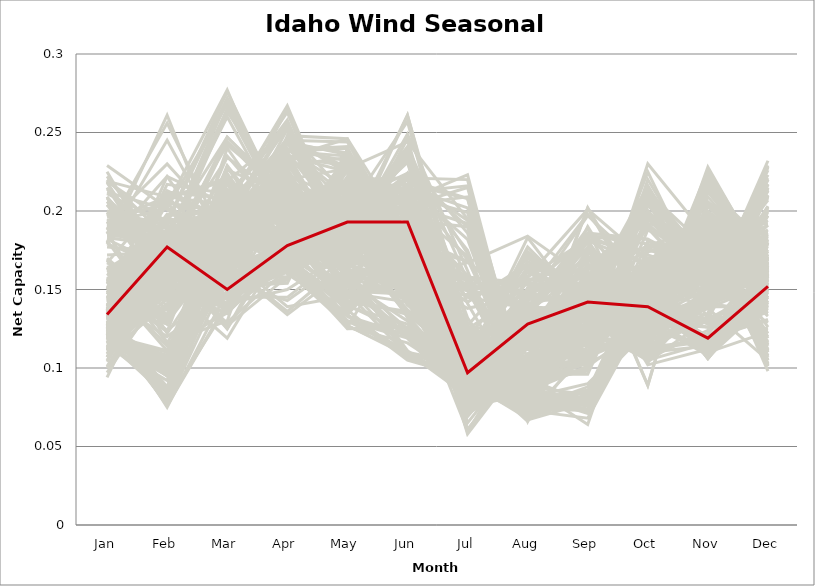
| Category | sample_001 | sample_002 | sample_003 | sample_004 | sample_005 | sample_006 | sample_007 | sample_008 | sample_009 | sample_010 | sample_011 | sample_012 | sample_013 | sample_014 | sample_015 | sample_016 | sample_017 | sample_018 | sample_019 | sample_020 | sample_021 | sample_022 | sample_023 | sample_024 | sample_025 | sample_026 | sample_027 | sample_028 | sample_029 | sample_030 | sample_031 | sample_032 | sample_033 | sample_034 | sample_035 | sample_036 | sample_037 | sample_038 | sample_039 | sample_040 | sample_041 | sample_042 | sample_043 | sample_044 | sample_045 | sample_046 | sample_047 | sample_048 | sample_049 | sample_050 | sample_051 | sample_052 | sample_053 | sample_054 | sample_055 | sample_056 | sample_057 | sample_058 | sample_059 | sample_060 | sample_061 | sample_062 | sample_063 | sample_064 | sample_065 | sample_066 | sample_067 | sample_068 | sample_069 | sample_070 | sample_071 | sample_072 | sample_073 | sample_074 | sample_075 | sample_076 | sample_077 | sample_078 | sample_079 | sample_080 | sample_081 | sample_082 | sample_083 | sample_084 | sample_085 | sample_086 | sample_087 | sample_088 | sample_089 | sample_090 | sample_091 | sample_092 | sample_093 | sample_094 | sample_095 | sample_096 | sample_097 | sample_098 | sample_099 | sample_100 | sample_101 | sample_102 | sample_103 | sample_104 | sample_105 | sample_106 | sample_107 | sample_108 | sample_109 | sample_110 | sample_111 | sample_112 | sample_113 | sample_114 | sample_115 | sample_116 | sample_117 | sample_118 | sample_119 | sample_120 | sample_121 | sample_122 | sample_123 | sample_124 | sample_125 | sample_126 | sample_127 | sample_128 | sample_129 | sample_130 | sample_131 | sample_132 | sample_133 | sample_134 | sample_135 | sample_136 | sample_137 | sample_138 | sample_139 | sample_140 | sample_141 | sample_142 | sample_143 | sample_144 | sample_145 | sample_146 | sample_147 | sample_148 | sample_149 | sample_150 | sample_151 | sample_152 | sample_153 | sample_154 | sample_155 | sample_156 | sample_157 | sample_158 | sample_159 | sample_160 | sample_161 | sample_162 | sample_163 | sample_164 | sample_165 | sample_166 | sample_167 | sample_168 | sample_169 | sample_170 | sample_171 | sample_172 | sample_173 | sample_174 | sample_175 | sample_176 | sample_177 | sample_178 | sample_179 | sample_180 | sample_181 | sample_183 | sample_184 | sample_185 | sample_186 | sample_187 | sample_188 | sample_189 | sample_190 | sample_191 | sample_192 | sample_193 | sample_194 | sample_195 | sample_196 | sample_197 | sample_198 | sample_199 | sample_200 | sample_201 | sample_202 | sample_203 | sample_204 | sample_205 | sample_206 | sample_207 | sample_208 | sample_209 | sample_210 | sample_211 | sample_212 | sample_213 | sample_214 | sample_215 | sample_216 | sample_217 | sample_218 | sample_219 | sample_220 | sample_221 | sample_222 | sample_223 | sample_224 | sample_225 | sample_226 | sample_227 | sample_228 | sample_229 | sample_230 | sample_231 | sample_232 | sample_233 | sample_234 | sample_235 | sample_236 | sample_237 | sample_238 | sample_239 | sample_240 | sample_241 | sample_242 | sample_243 | sample_244 | sample_245 | sample_246 | sample_247 | sample_248 | sample_249 | sample_250 | sample_182 |
|---|---|---|---|---|---|---|---|---|---|---|---|---|---|---|---|---|---|---|---|---|---|---|---|---|---|---|---|---|---|---|---|---|---|---|---|---|---|---|---|---|---|---|---|---|---|---|---|---|---|---|---|---|---|---|---|---|---|---|---|---|---|---|---|---|---|---|---|---|---|---|---|---|---|---|---|---|---|---|---|---|---|---|---|---|---|---|---|---|---|---|---|---|---|---|---|---|---|---|---|---|---|---|---|---|---|---|---|---|---|---|---|---|---|---|---|---|---|---|---|---|---|---|---|---|---|---|---|---|---|---|---|---|---|---|---|---|---|---|---|---|---|---|---|---|---|---|---|---|---|---|---|---|---|---|---|---|---|---|---|---|---|---|---|---|---|---|---|---|---|---|---|---|---|---|---|---|---|---|---|---|---|---|---|---|---|---|---|---|---|---|---|---|---|---|---|---|---|---|---|---|---|---|---|---|---|---|---|---|---|---|---|---|---|---|---|---|---|---|---|---|---|---|---|---|---|---|---|---|---|---|---|---|---|---|---|---|---|---|---|---|---|---|---|---|---|---|---|---|---|---|
| Jan | 0.162 | 0.135 | 0.179 | 0.112 | 0.193 | 0.135 | 0.128 | 0.126 | 0.18 | 0.145 | 0.206 | 0.135 | 0.132 | 0.184 | 0.127 | 0.115 | 0.113 | 0.101 | 0.123 | 0.209 | 0.133 | 0.133 | 0.115 | 0.134 | 0.14 | 0.152 | 0.145 | 0.219 | 0.114 | 0.206 | 0.137 | 0.198 | 0.094 | 0.157 | 0.126 | 0.132 | 0.124 | 0.112 | 0.164 | 0.109 | 0.156 | 0.192 | 0.111 | 0.115 | 0.189 | 0.13 | 0.125 | 0.119 | 0.151 | 0.116 | 0.139 | 0.135 | 0.185 | 0.2 | 0.119 | 0.118 | 0.119 | 0.215 | 0.194 | 0.193 | 0.116 | 0.12 | 0.126 | 0.204 | 0.119 | 0.187 | 0.151 | 0.122 | 0.115 | 0.219 | 0.139 | 0.127 | 0.154 | 0.155 | 0.12 | 0.192 | 0.146 | 0.22 | 0.188 | 0.135 | 0.139 | 0.179 | 0.109 | 0.128 | 0.19 | 0.192 | 0.127 | 0.112 | 0.16 | 0.172 | 0.157 | 0.138 | 0.127 | 0.128 | 0.212 | 0.225 | 0.124 | 0.15 | 0.19 | 0.121 | 0.148 | 0.147 | 0.199 | 0.183 | 0.151 | 0.145 | 0.13 | 0.12 | 0.1 | 0.122 | 0.133 | 0.12 | 0.123 | 0.124 | 0.107 | 0.138 | 0.214 | 0.155 | 0.19 | 0.169 | 0.177 | 0.126 | 0.12 | 0.132 | 0.117 | 0.115 | 0.208 | 0.122 | 0.142 | 0.133 | 0.125 | 0.126 | 0.155 | 0.138 | 0.148 | 0.152 | 0.138 | 0.163 | 0.154 | 0.138 | 0.124 | 0.155 | 0.147 | 0.132 | 0.124 | 0.139 | 0.14 | 0.167 | 0.187 | 0.135 | 0.121 | 0.134 | 0.189 | 0.144 | 0.136 | 0.154 | 0.097 | 0.229 | 0.144 | 0.15 | 0.118 | 0.104 | 0.124 | 0.204 | 0.19 | 0.123 | 0.211 | 0.118 | 0.12 | 0.123 | 0.152 | 0.122 | 0.142 | 0.196 | 0.156 | 0.148 | 0.133 | 0.193 | 0.132 | 0.118 | 0.116 | 0.126 | 0.187 | 0.136 | 0.164 | 0.188 | 0.109 | 0.131 | 0.192 | 0.12 | 0.107 | 0.218 | 0.144 | 0.12 | 0.117 | 0.12 | 0.119 | 0.128 | 0.121 | 0.136 | 0.118 | 0.191 | 0.137 | 0.122 | 0.222 | 0.17 | 0.118 | 0.135 | 0.179 | 0.111 | 0.121 | 0.105 | 0.136 | 0.14 | 0.155 | 0.182 | 0.111 | 0.126 | 0.132 | 0.185 | 0.192 | 0.122 | 0.133 | 0.199 | 0.2 | 0.181 | 0.137 | 0.19 | 0.107 | 0.167 | 0.13 | 0.127 | 0.219 | 0.161 | 0.112 | 0.159 | 0.188 | 0.143 | 0.121 | 0.128 | 0.164 | 0.122 | 0.188 | 0.139 | 0.129 | 0.129 | 0.148 | 0.13 | 0.209 | 0.134 |
| Feb | 0.179 | 0.157 | 0.164 | 0.162 | 0.209 | 0.222 | 0.077 | 0.169 | 0.245 | 0.17 | 0.17 | 0.086 | 0.137 | 0.183 | 0.188 | 0.1 | 0.168 | 0.161 | 0.175 | 0.138 | 0.167 | 0.081 | 0.098 | 0.15 | 0.148 | 0.124 | 0.178 | 0.209 | 0.108 | 0.174 | 0.176 | 0.171 | 0.173 | 0.129 | 0.15 | 0.088 | 0.099 | 0.108 | 0.116 | 0.173 | 0.183 | 0.195 | 0.163 | 0.086 | 0.174 | 0.083 | 0.183 | 0.161 | 0.123 | 0.174 | 0.079 | 0.086 | 0.184 | 0.191 | 0.107 | 0.179 | 0.166 | 0.156 | 0.205 | 0.166 | 0.151 | 0.11 | 0.087 | 0.154 | 0.157 | 0.116 | 0.168 | 0.102 | 0.106 | 0.193 | 0.128 | 0.182 | 0.178 | 0.128 | 0.169 | 0.187 | 0.144 | 0.183 | 0.256 | 0.166 | 0.168 | 0.222 | 0.151 | 0.174 | 0.193 | 0.23 | 0.157 | 0.161 | 0.147 | 0.174 | 0.18 | 0.087 | 0.104 | 0.085 | 0.201 | 0.16 | 0.166 | 0.134 | 0.195 | 0.158 | 0.165 | 0.194 | 0.148 | 0.178 | 0.185 | 0.171 | 0.076 | 0.159 | 0.15 | 0.169 | 0.148 | 0.173 | 0.158 | 0.166 | 0.151 | 0.183 | 0.176 | 0.175 | 0.176 | 0.13 | 0.174 | 0.152 | 0.096 | 0.155 | 0.095 | 0.092 | 0.173 | 0.171 | 0.131 | 0.145 | 0.182 | 0.159 | 0.195 | 0.148 | 0.179 | 0.17 | 0.084 | 0.187 | 0.169 | 0.131 | 0.157 | 0.114 | 0.188 | 0.176 | 0.14 | 0.205 | 0.187 | 0.143 | 0.173 | 0.075 | 0.111 | 0.085 | 0.175 | 0.12 | 0.16 | 0.213 | 0.153 | 0.202 | 0.193 | 0.209 | 0.104 | 0.164 | 0.148 | 0.18 | 0.183 | 0.101 | 0.192 | 0.1 | 0.108 | 0.172 | 0.128 | 0.163 | 0.174 | 0.204 | 0.186 | 0.131 | 0.187 | 0.177 | 0.174 | 0.154 | 0.087 | 0.163 | 0.122 | 0.208 | 0.177 | 0.181 | 0.141 | 0.179 | 0.202 | 0.16 | 0.173 | 0.163 | 0.186 | 0.108 | 0.082 | 0.099 | 0.102 | 0.077 | 0.212 | 0.167 | 0.146 | 0.182 | 0.217 | 0.095 | 0.171 | 0.137 | 0.14 | 0.16 | 0.261 | 0.156 | 0.158 | 0.17 | 0.176 | 0.197 | 0.111 | 0.164 | 0.144 | 0.077 | 0.164 | 0.185 | 0.189 | 0.102 | 0.18 | 0.184 | 0.182 | 0.13 | 0.206 | 0.181 | 0.166 | 0.211 | 0.156 | 0.148 | 0.145 | 0.178 | 0.164 | 0.188 | 0.191 | 0.17 | 0.174 | 0.17 | 0.134 | 0.095 | 0.187 | 0.133 | 0.079 | 0.17 | 0.198 | 0.152 | 0.164 | 0.177 |
| Mar | 0.177 | 0.175 | 0.18 | 0.217 | 0.173 | 0.204 | 0.168 | 0.15 | 0.175 | 0.214 | 0.193 | 0.186 | 0.204 | 0.194 | 0.157 | 0.2 | 0.166 | 0.197 | 0.146 | 0.201 | 0.125 | 0.166 | 0.21 | 0.138 | 0.14 | 0.154 | 0.182 | 0.204 | 0.207 | 0.185 | 0.144 | 0.247 | 0.135 | 0.179 | 0.166 | 0.184 | 0.202 | 0.219 | 0.13 | 0.169 | 0.187 | 0.184 | 0.213 | 0.202 | 0.19 | 0.162 | 0.158 | 0.155 | 0.224 | 0.149 | 0.169 | 0.169 | 0.26 | 0.162 | 0.184 | 0.165 | 0.163 | 0.197 | 0.17 | 0.244 | 0.163 | 0.167 | 0.181 | 0.187 | 0.129 | 0.177 | 0.206 | 0.196 | 0.169 | 0.173 | 0.193 | 0.127 | 0.18 | 0.24 | 0.156 | 0.187 | 0.235 | 0.2 | 0.179 | 0.145 | 0.153 | 0.165 | 0.201 | 0.145 | 0.276 | 0.188 | 0.212 | 0.211 | 0.182 | 0.244 | 0.183 | 0.183 | 0.205 | 0.19 | 0.173 | 0.204 | 0.152 | 0.229 | 0.168 | 0.144 | 0.196 | 0.19 | 0.201 | 0.242 | 0.191 | 0.182 | 0.141 | 0.17 | 0.135 | 0.171 | 0.144 | 0.152 | 0.155 | 0.154 | 0.198 | 0.135 | 0.263 | 0.189 | 0.234 | 0.181 | 0.187 | 0.16 | 0.201 | 0.174 | 0.195 | 0.196 | 0.187 | 0.146 | 0.184 | 0.191 | 0.16 | 0.217 | 0.19 | 0.135 | 0.186 | 0.196 | 0.175 | 0.193 | 0.139 | 0.194 | 0.17 | 0.135 | 0.194 | 0.162 | 0.197 | 0.2 | 0.205 | 0.183 | 0.197 | 0.149 | 0.193 | 0.172 | 0.175 | 0.147 | 0.155 | 0.194 | 0.119 | 0.183 | 0.204 | 0.219 | 0.174 | 0.166 | 0.195 | 0.158 | 0.265 | 0.207 | 0.272 | 0.207 | 0.203 | 0.168 | 0.228 | 0.146 | 0.135 | 0.277 | 0.145 | 0.228 | 0.188 | 0.179 | 0.139 | 0.151 | 0.194 | 0.168 | 0.18 | 0.221 | 0.184 | 0.271 | 0.187 | 0.185 | 0.268 | 0.171 | 0.167 | 0.199 | 0.204 | 0.182 | 0.19 | 0.202 | 0.191 | 0.141 | 0.208 | 0.137 | 0.165 | 0.271 | 0.211 | 0.196 | 0.184 | 0.19 | 0.199 | 0.144 | 0.165 | 0.198 | 0.162 | 0.145 | 0.125 | 0.202 | 0.137 | 0.226 | 0.152 | 0.159 | 0.145 | 0.2 | 0.17 | 0.161 | 0.189 | 0.157 | 0.174 | 0.181 | 0.192 | 0.166 | 0.141 | 0.193 | 0.212 | 0.221 | 0.189 | 0.183 | 0.155 | 0.191 | 0.172 | 0.144 | 0.154 | 0.156 | 0.178 | 0.193 | 0.247 | 0.212 | 0.139 | 0.149 | 0.192 | 0.18 | 0.192 | 0.15 |
| Apr | 0.178 | 0.179 | 0.212 | 0.168 | 0.225 | 0.195 | 0.238 | 0.163 | 0.208 | 0.187 | 0.201 | 0.247 | 0.167 | 0.179 | 0.164 | 0.253 | 0.134 | 0.169 | 0.165 | 0.202 | 0.186 | 0.234 | 0.253 | 0.177 | 0.189 | 0.229 | 0.201 | 0.225 | 0.258 | 0.207 | 0.182 | 0.21 | 0.174 | 0.176 | 0.161 | 0.234 | 0.246 | 0.251 | 0.237 | 0.201 | 0.208 | 0.206 | 0.166 | 0.211 | 0.204 | 0.239 | 0.167 | 0.178 | 0.17 | 0.167 | 0.243 | 0.238 | 0.19 | 0.231 | 0.208 | 0.193 | 0.18 | 0.209 | 0.199 | 0.209 | 0.18 | 0.219 | 0.252 | 0.215 | 0.163 | 0.191 | 0.2 | 0.207 | 0.214 | 0.237 | 0.17 | 0.158 | 0.21 | 0.186 | 0.179 | 0.206 | 0.191 | 0.217 | 0.192 | 0.182 | 0.178 | 0.201 | 0.171 | 0.165 | 0.197 | 0.216 | 0.197 | 0.167 | 0.177 | 0.204 | 0.198 | 0.239 | 0.244 | 0.243 | 0.232 | 0.236 | 0.154 | 0.179 | 0.215 | 0.168 | 0.187 | 0.166 | 0.198 | 0.21 | 0.202 | 0.198 | 0.247 | 0.165 | 0.172 | 0.194 | 0.163 | 0.166 | 0.177 | 0.17 | 0.16 | 0.174 | 0.21 | 0.202 | 0.207 | 0.188 | 0.205 | 0.158 | 0.212 | 0.177 | 0.24 | 0.256 | 0.217 | 0.176 | 0.165 | 0.171 | 0.166 | 0.192 | 0.168 | 0.191 | 0.203 | 0.161 | 0.229 | 0.167 | 0.188 | 0.183 | 0.171 | 0.237 | 0.22 | 0.178 | 0.164 | 0.195 | 0.212 | 0.178 | 0.197 | 0.245 | 0.265 | 0.235 | 0.203 | 0.222 | 0.186 | 0.166 | 0.182 | 0.216 | 0.221 | 0.191 | 0.212 | 0.204 | 0.166 | 0.233 | 0.193 | 0.256 | 0.2 | 0.263 | 0.267 | 0.165 | 0.177 | 0.161 | 0.192 | 0.187 | 0.207 | 0.172 | 0.197 | 0.206 | 0.191 | 0.166 | 0.239 | 0.166 | 0.186 | 0.19 | 0.206 | 0.193 | 0.166 | 0.214 | 0.196 | 0.139 | 0.136 | 0.201 | 0.182 | 0.209 | 0.236 | 0.212 | 0.256 | 0.248 | 0.193 | 0.165 | 0.19 | 0.2 | 0.192 | 0.203 | 0.22 | 0.188 | 0.174 | 0.183 | 0.2 | 0.162 | 0.164 | 0.145 | 0.194 | 0.216 | 0.244 | 0.211 | 0.185 | 0.244 | 0.158 | 0.186 | 0.22 | 0.22 | 0.223 | 0.217 | 0.227 | 0.185 | 0.205 | 0.226 | 0.15 | 0.186 | 0.202 | 0.187 | 0.21 | 0.201 | 0.143 | 0.21 | 0.223 | 0.175 | 0.17 | 0.177 | 0.177 | 0.216 | 0.208 | 0.172 | 0.244 | 0.156 | 0.22 | 0.175 | 0.207 | 0.178 |
| May | 0.205 | 0.189 | 0.149 | 0.126 | 0.172 | 0.215 | 0.24 | 0.22 | 0.207 | 0.137 | 0.166 | 0.224 | 0.125 | 0.148 | 0.239 | 0.186 | 0.163 | 0.137 | 0.231 | 0.171 | 0.195 | 0.246 | 0.168 | 0.221 | 0.218 | 0.183 | 0.208 | 0.192 | 0.168 | 0.152 | 0.181 | 0.193 | 0.201 | 0.152 | 0.192 | 0.229 | 0.195 | 0.163 | 0.188 | 0.201 | 0.211 | 0.196 | 0.13 | 0.191 | 0.149 | 0.241 | 0.238 | 0.212 | 0.142 | 0.212 | 0.237 | 0.235 | 0.182 | 0.172 | 0.2 | 0.204 | 0.211 | 0.161 | 0.169 | 0.193 | 0.168 | 0.172 | 0.209 | 0.163 | 0.19 | 0.161 | 0.137 | 0.189 | 0.174 | 0.169 | 0.14 | 0.183 | 0.19 | 0.144 | 0.211 | 0.161 | 0.135 | 0.189 | 0.215 | 0.181 | 0.227 | 0.182 | 0.127 | 0.222 | 0.191 | 0.183 | 0.138 | 0.134 | 0.158 | 0.194 | 0.195 | 0.232 | 0.189 | 0.203 | 0.172 | 0.17 | 0.232 | 0.149 | 0.184 | 0.206 | 0.136 | 0.182 | 0.161 | 0.195 | 0.22 | 0.216 | 0.226 | 0.197 | 0.195 | 0.214 | 0.185 | 0.226 | 0.203 | 0.218 | 0.134 | 0.192 | 0.182 | 0.215 | 0.184 | 0.16 | 0.159 | 0.194 | 0.196 | 0.184 | 0.209 | 0.179 | 0.162 | 0.2 | 0.133 | 0.139 | 0.239 | 0.134 | 0.184 | 0.225 | 0.208 | 0.177 | 0.234 | 0.18 | 0.188 | 0.142 | 0.192 | 0.192 | 0.202 | 0.235 | 0.13 | 0.181 | 0.204 | 0.157 | 0.158 | 0.244 | 0.171 | 0.225 | 0.148 | 0.177 | 0.227 | 0.177 | 0.148 | 0.183 | 0.194 | 0.207 | 0.179 | 0.215 | 0.129 | 0.166 | 0.173 | 0.166 | 0.178 | 0.168 | 0.177 | 0.234 | 0.141 | 0.206 | 0.197 | 0.184 | 0.187 | 0.147 | 0.208 | 0.145 | 0.208 | 0.199 | 0.215 | 0.191 | 0.163 | 0.169 | 0.209 | 0.18 | 0.133 | 0.2 | 0.188 | 0.146 | 0.168 | 0.161 | 0.193 | 0.186 | 0.198 | 0.198 | 0.179 | 0.246 | 0.182 | 0.18 | 0.176 | 0.181 | 0.213 | 0.197 | 0.184 | 0.154 | 0.13 | 0.235 | 0.216 | 0.127 | 0.198 | 0.175 | 0.199 | 0.198 | 0.181 | 0.195 | 0.178 | 0.236 | 0.186 | 0.155 | 0.184 | 0.175 | 0.206 | 0.167 | 0.16 | 0.164 | 0.22 | 0.162 | 0.175 | 0.174 | 0.126 | 0.135 | 0.157 | 0.213 | 0.17 | 0.214 | 0.176 | 0.189 | 0.226 | 0.22 | 0.152 | 0.189 | 0.192 | 0.146 | 0.228 | 0.239 | 0.227 | 0.197 | 0.157 | 0.193 |
| Jun | 0.2 | 0.145 | 0.148 | 0.116 | 0.163 | 0.217 | 0.159 | 0.158 | 0.175 | 0.188 | 0.15 | 0.166 | 0.126 | 0.125 | 0.182 | 0.188 | 0.191 | 0.106 | 0.164 | 0.155 | 0.152 | 0.16 | 0.199 | 0.187 | 0.179 | 0.261 | 0.194 | 0.178 | 0.207 | 0.146 | 0.205 | 0.215 | 0.171 | 0.119 | 0.148 | 0.159 | 0.191 | 0.205 | 0.239 | 0.132 | 0.204 | 0.17 | 0.119 | 0.232 | 0.147 | 0.156 | 0.166 | 0.159 | 0.16 | 0.148 | 0.177 | 0.146 | 0.201 | 0.16 | 0.257 | 0.154 | 0.171 | 0.181 | 0.169 | 0.235 | 0.191 | 0.24 | 0.169 | 0.186 | 0.142 | 0.123 | 0.193 | 0.235 | 0.246 | 0.162 | 0.122 | 0.137 | 0.204 | 0.17 | 0.152 | 0.145 | 0.184 | 0.168 | 0.175 | 0.201 | 0.182 | 0.169 | 0.109 | 0.153 | 0.211 | 0.181 | 0.19 | 0.105 | 0.125 | 0.21 | 0.22 | 0.161 | 0.202 | 0.172 | 0.163 | 0.19 | 0.168 | 0.162 | 0.162 | 0.146 | 0.18 | 0.136 | 0.149 | 0.231 | 0.221 | 0.203 | 0.181 | 0.146 | 0.183 | 0.175 | 0.164 | 0.166 | 0.155 | 0.156 | 0.107 | 0.164 | 0.236 | 0.207 | 0.209 | 0.11 | 0.143 | 0.15 | 0.232 | 0.147 | 0.191 | 0.194 | 0.159 | 0.148 | 0.121 | 0.128 | 0.179 | 0.175 | 0.133 | 0.179 | 0.21 | 0.146 | 0.153 | 0.134 | 0.21 | 0.136 | 0.152 | 0.241 | 0.22 | 0.176 | 0.121 | 0.176 | 0.232 | 0.12 | 0.145 | 0.179 | 0.2 | 0.163 | 0.142 | 0.261 | 0.176 | 0.137 | 0.108 | 0.166 | 0.223 | 0.201 | 0.237 | 0.144 | 0.126 | 0.155 | 0.215 | 0.2 | 0.222 | 0.204 | 0.21 | 0.176 | 0.172 | 0.141 | 0.163 | 0.206 | 0.212 | 0.153 | 0.199 | 0.134 | 0.163 | 0.143 | 0.176 | 0.149 | 0.111 | 0.159 | 0.212 | 0.214 | 0.11 | 0.216 | 0.2 | 0.191 | 0.173 | 0.156 | 0.14 | 0.238 | 0.175 | 0.234 | 0.193 | 0.185 | 0.157 | 0.18 | 0.18 | 0.224 | 0.206 | 0.216 | 0.171 | 0.121 | 0.11 | 0.194 | 0.166 | 0.108 | 0.143 | 0.169 | 0.155 | 0.232 | 0.249 | 0.209 | 0.197 | 0.178 | 0.149 | 0.13 | 0.158 | 0.236 | 0.224 | 0.164 | 0.157 | 0.107 | 0.204 | 0.16 | 0.169 | 0.15 | 0.189 | 0.182 | 0.19 | 0.215 | 0.192 | 0.217 | 0.167 | 0.196 | 0.154 | 0.159 | 0.11 | 0.22 | 0.224 | 0.155 | 0.171 | 0.157 | 0.244 | 0.153 | 0.157 | 0.193 |
| Jul | 0.118 | 0.125 | 0.081 | 0.091 | 0.099 | 0.169 | 0.167 | 0.075 | 0.111 | 0.08 | 0.075 | 0.149 | 0.087 | 0.083 | 0.084 | 0.108 | 0.097 | 0.098 | 0.083 | 0.074 | 0.1 | 0.151 | 0.105 | 0.102 | 0.109 | 0.12 | 0.19 | 0.111 | 0.109 | 0.074 | 0.094 | 0.094 | 0.153 | 0.078 | 0.115 | 0.138 | 0.114 | 0.099 | 0.141 | 0.09 | 0.209 | 0.107 | 0.091 | 0.103 | 0.076 | 0.146 | 0.082 | 0.082 | 0.078 | 0.105 | 0.152 | 0.147 | 0.099 | 0.12 | 0.117 | 0.086 | 0.084 | 0.061 | 0.104 | 0.122 | 0.15 | 0.11 | 0.142 | 0.058 | 0.112 | 0.09 | 0.081 | 0.105 | 0.111 | 0.123 | 0.088 | 0.105 | 0.192 | 0.074 | 0.098 | 0.076 | 0.075 | 0.118 | 0.11 | 0.096 | 0.11 | 0.1 | 0.099 | 0.081 | 0.105 | 0.112 | 0.079 | 0.094 | 0.084 | 0.106 | 0.208 | 0.158 | 0.111 | 0.12 | 0.119 | 0.065 | 0.093 | 0.071 | 0.103 | 0.108 | 0.072 | 0.098 | 0.076 | 0.103 | 0.22 | 0.215 | 0.145 | 0.122 | 0.129 | 0.092 | 0.1 | 0.084 | 0.084 | 0.083 | 0.096 | 0.096 | 0.132 | 0.223 | 0.092 | 0.088 | 0.076 | 0.107 | 0.112 | 0.123 | 0.125 | 0.109 | 0.108 | 0.097 | 0.088 | 0.089 | 0.089 | 0.074 | 0.091 | 0.108 | 0.199 | 0.093 | 0.154 | 0.103 | 0.099 | 0.101 | 0.123 | 0.156 | 0.194 | 0.089 | 0.092 | 0.099 | 0.173 | 0.083 | 0.085 | 0.168 | 0.105 | 0.142 | 0.079 | 0.127 | 0.107 | 0.11 | 0.103 | 0.103 | 0.175 | 0.15 | 0.114 | 0.098 | 0.094 | 0.115 | 0.091 | 0.093 | 0.099 | 0.104 | 0.105 | 0.095 | 0.069 | 0.099 | 0.101 | 0.1 | 0.101 | 0.072 | 0.159 | 0.076 | 0.105 | 0.099 | 0.127 | 0.115 | 0.085 | 0.075 | 0.216 | 0.101 | 0.102 | 0.182 | 0.096 | 0.098 | 0.087 | 0.06 | 0.111 | 0.116 | 0.12 | 0.118 | 0.102 | 0.168 | 0.091 | 0.094 | 0.158 | 0.104 | 0.155 | 0.106 | 0.113 | 0.081 | 0.096 | 0.112 | 0.117 | 0.088 | 0.111 | 0.089 | 0.101 | 0.186 | 0.162 | 0.105 | 0.15 | 0.155 | 0.099 | 0.089 | 0.107 | 0.11 | 0.19 | 0.11 | 0.122 | 0.091 | 0.171 | 0.111 | 0.096 | 0.125 | 0.08 | 0.076 | 0.059 | 0.202 | 0.107 | 0.208 | 0.11 | 0.091 | 0.076 | 0.08 | 0.082 | 0.105 | 0.096 | 0.071 | 0.158 | 0.098 | 0.195 | 0.117 | 0.077 | 0.097 |
| Aug | 0.109 | 0.098 | 0.116 | 0.071 | 0.125 | 0.087 | 0.184 | 0.138 | 0.092 | 0.109 | 0.115 | 0.157 | 0.076 | 0.117 | 0.125 | 0.173 | 0.107 | 0.075 | 0.151 | 0.129 | 0.128 | 0.149 | 0.172 | 0.139 | 0.132 | 0.072 | 0.071 | 0.101 | 0.174 | 0.121 | 0.124 | 0.079 | 0.102 | 0.086 | 0.107 | 0.146 | 0.155 | 0.165 | 0.076 | 0.142 | 0.075 | 0.103 | 0.071 | 0.096 | 0.107 | 0.156 | 0.131 | 0.158 | 0.105 | 0.125 | 0.147 | 0.153 | 0.073 | 0.114 | 0.087 | 0.139 | 0.132 | 0.108 | 0.09 | 0.074 | 0.079 | 0.087 | 0.165 | 0.108 | 0.102 | 0.096 | 0.102 | 0.098 | 0.086 | 0.12 | 0.078 | 0.098 | 0.073 | 0.1 | 0.122 | 0.118 | 0.1 | 0.115 | 0.083 | 0.115 | 0.13 | 0.092 | 0.071 | 0.138 | 0.073 | 0.095 | 0.106 | 0.073 | 0.087 | 0.082 | 0.078 | 0.154 | 0.145 | 0.163 | 0.118 | 0.113 | 0.131 | 0.1 | 0.134 | 0.121 | 0.114 | 0.143 | 0.123 | 0.084 | 0.07 | 0.073 | 0.138 | 0.128 | 0.099 | 0.136 | 0.119 | 0.136 | 0.146 | 0.15 | 0.088 | 0.134 | 0.074 | 0.078 | 0.073 | 0.092 | 0.123 | 0.122 | 0.1 | 0.098 | 0.149 | 0.168 | 0.12 | 0.127 | 0.078 | 0.07 | 0.13 | 0.108 | 0.156 | 0.132 | 0.072 | 0.137 | 0.154 | 0.136 | 0.122 | 0.066 | 0.126 | 0.07 | 0.074 | 0.146 | 0.073 | 0.08 | 0.074 | 0.091 | 0.104 | 0.133 | 0.174 | 0.166 | 0.116 | 0.068 | 0.128 | 0.144 | 0.085 | 0.113 | 0.077 | 0.095 | 0.086 | 0.148 | 0.076 | 0.132 | 0.068 | 0.174 | 0.07 | 0.183 | 0.177 | 0.129 | 0.114 | 0.128 | 0.122 | 0.083 | 0.118 | 0.099 | 0.089 | 0.127 | 0.126 | 0.124 | 0.17 | 0.112 | 0.091 | 0.084 | 0.088 | 0.078 | 0.089 | 0.078 | 0.08 | 0.098 | 0.107 | 0.115 | 0.148 | 0.082 | 0.162 | 0.095 | 0.161 | 0.136 | 0.078 | 0.127 | 0.068 | 0.07 | 0.093 | 0.114 | 0.128 | 0.085 | 0.089 | 0.135 | 0.095 | 0.078 | 0.127 | 0.116 | 0.128 | 0.071 | 0.066 | 0.081 | 0.079 | 0.136 | 0.112 | 0.104 | 0.131 | 0.093 | 0.08 | 0.127 | 0.125 | 0.09 | 0.088 | 0.112 | 0.124 | 0.127 | 0.106 | 0.102 | 0.124 | 0.077 | 0.106 | 0.067 | 0.117 | 0.132 | 0.151 | 0.158 | 0.089 | 0.097 | 0.081 | 0.092 | 0.138 | 0.141 | 0.082 | 0.118 | 0.12 | 0.128 |
| Sep | 0.139 | 0.119 | 0.115 | 0.147 | 0.108 | 0.079 | 0.157 | 0.168 | 0.137 | 0.117 | 0.108 | 0.147 | 0.137 | 0.139 | 0.159 | 0.15 | 0.159 | 0.146 | 0.159 | 0.131 | 0.145 | 0.161 | 0.137 | 0.137 | 0.145 | 0.161 | 0.081 | 0.136 | 0.14 | 0.115 | 0.149 | 0.086 | 0.109 | 0.101 | 0.126 | 0.143 | 0.145 | 0.138 | 0.159 | 0.197 | 0.08 | 0.14 | 0.142 | 0.145 | 0.111 | 0.157 | 0.156 | 0.201 | 0.124 | 0.145 | 0.161 | 0.153 | 0.08 | 0.11 | 0.152 | 0.183 | 0.185 | 0.125 | 0.13 | 0.085 | 0.135 | 0.158 | 0.15 | 0.136 | 0.202 | 0.096 | 0.109 | 0.146 | 0.155 | 0.109 | 0.128 | 0.202 | 0.081 | 0.116 | 0.149 | 0.11 | 0.106 | 0.125 | 0.146 | 0.14 | 0.136 | 0.144 | 0.142 | 0.186 | 0.079 | 0.142 | 0.108 | 0.143 | 0.106 | 0.084 | 0.074 | 0.149 | 0.14 | 0.142 | 0.104 | 0.134 | 0.143 | 0.115 | 0.117 | 0.148 | 0.124 | 0.159 | 0.118 | 0.073 | 0.081 | 0.083 | 0.172 | 0.133 | 0.103 | 0.181 | 0.181 | 0.164 | 0.175 | 0.184 | 0.151 | 0.148 | 0.088 | 0.085 | 0.068 | 0.098 | 0.111 | 0.14 | 0.145 | 0.116 | 0.136 | 0.145 | 0.12 | 0.154 | 0.123 | 0.11 | 0.158 | 0.106 | 0.167 | 0.147 | 0.081 | 0.14 | 0.149 | 0.132 | 0.175 | 0.114 | 0.133 | 0.158 | 0.073 | 0.17 | 0.131 | 0.125 | 0.078 | 0.107 | 0.128 | 0.177 | 0.143 | 0.156 | 0.122 | 0.155 | 0.127 | 0.147 | 0.155 | 0.146 | 0.077 | 0.099 | 0.175 | 0.198 | 0.147 | 0.114 | 0.082 | 0.135 | 0.083 | 0.133 | 0.139 | 0.147 | 0.131 | 0.148 | 0.145 | 0.071 | 0.166 | 0.117 | 0.064 | 0.121 | 0.148 | 0.152 | 0.143 | 0.128 | 0.104 | 0.156 | 0.083 | 0.076 | 0.162 | 0.079 | 0.081 | 0.154 | 0.156 | 0.124 | 0.137 | 0.165 | 0.129 | 0.15 | 0.149 | 0.18 | 0.174 | 0.142 | 0.136 | 0.078 | 0.078 | 0.166 | 0.135 | 0.101 | 0.154 | 0.135 | 0.159 | 0.157 | 0.146 | 0.169 | 0.155 | 0.077 | 0.158 | 0.09 | 0.131 | 0.182 | 0.19 | 0.128 | 0.109 | 0.158 | 0.077 | 0.107 | 0.117 | 0.103 | 0.072 | 0.107 | 0.169 | 0.138 | 0.109 | 0.103 | 0.123 | 0.078 | 0.156 | 0.078 | 0.101 | 0.152 | 0.184 | 0.182 | 0.099 | 0.138 | 0.078 | 0.117 | 0.189 | 0.148 | 0.077 | 0.127 | 0.109 | 0.142 |
| Oct | 0.145 | 0.153 | 0.158 | 0.203 | 0.131 | 0.174 | 0.126 | 0.177 | 0.108 | 0.137 | 0.159 | 0.119 | 0.211 | 0.15 | 0.2 | 0.121 | 0.165 | 0.211 | 0.189 | 0.157 | 0.144 | 0.117 | 0.132 | 0.207 | 0.212 | 0.137 | 0.158 | 0.104 | 0.125 | 0.162 | 0.132 | 0.125 | 0.196 | 0.206 | 0.16 | 0.118 | 0.123 | 0.13 | 0.136 | 0.162 | 0.159 | 0.104 | 0.212 | 0.166 | 0.168 | 0.118 | 0.2 | 0.168 | 0.157 | 0.158 | 0.118 | 0.119 | 0.139 | 0.119 | 0.146 | 0.151 | 0.166 | 0.144 | 0.106 | 0.124 | 0.192 | 0.144 | 0.126 | 0.131 | 0.131 | 0.181 | 0.13 | 0.162 | 0.14 | 0.125 | 0.216 | 0.138 | 0.157 | 0.152 | 0.153 | 0.165 | 0.156 | 0.105 | 0.12 | 0.127 | 0.215 | 0.109 | 0.197 | 0.182 | 0.134 | 0.111 | 0.16 | 0.207 | 0.22 | 0.145 | 0.151 | 0.125 | 0.133 | 0.124 | 0.117 | 0.131 | 0.213 | 0.167 | 0.129 | 0.143 | 0.143 | 0.11 | 0.162 | 0.135 | 0.16 | 0.156 | 0.103 | 0.164 | 0.198 | 0.166 | 0.129 | 0.198 | 0.161 | 0.182 | 0.197 | 0.139 | 0.13 | 0.167 | 0.138 | 0.188 | 0.168 | 0.147 | 0.158 | 0.147 | 0.128 | 0.113 | 0.111 | 0.155 | 0.225 | 0.209 | 0.198 | 0.166 | 0.102 | 0.216 | 0.16 | 0.129 | 0.122 | 0.135 | 0.125 | 0.23 | 0.155 | 0.132 | 0.157 | 0.176 | 0.192 | 0.169 | 0.166 | 0.214 | 0.149 | 0.089 | 0.119 | 0.12 | 0.156 | 0.142 | 0.211 | 0.112 | 0.115 | 0.114 | 0.161 | 0.17 | 0.132 | 0.151 | 0.204 | 0.117 | 0.146 | 0.129 | 0.14 | 0.116 | 0.118 | 0.205 | 0.157 | 0.15 | 0.135 | 0.146 | 0.113 | 0.169 | 0.175 | 0.16 | 0.145 | 0.153 | 0.132 | 0.153 | 0.194 | 0.178 | 0.157 | 0.149 | 0.2 | 0.166 | 0.134 | 0.167 | 0.149 | 0.15 | 0.129 | 0.141 | 0.116 | 0.147 | 0.112 | 0.089 | 0.159 | 0.139 | 0.178 | 0.138 | 0.167 | 0.155 | 0.111 | 0.21 | 0.195 | 0.215 | 0.113 | 0.189 | 0.161 | 0.151 | 0.136 | 0.156 | 0.137 | 0.128 | 0.19 | 0.109 | 0.129 | 0.148 | 0.122 | 0.14 | 0.165 | 0.131 | 0.121 | 0.197 | 0.178 | 0.123 | 0.14 | 0.105 | 0.164 | 0.155 | 0.14 | 0.16 | 0.16 | 0.154 | 0.129 | 0.13 | 0.179 | 0.172 | 0.199 | 0.161 | 0.146 | 0.165 | 0.105 | 0.209 | 0.155 | 0.156 | 0.161 | 0.139 |
| Nov | 0.11 | 0.117 | 0.19 | 0.177 | 0.139 | 0.182 | 0.198 | 0.15 | 0.14 | 0.159 | 0.193 | 0.212 | 0.159 | 0.191 | 0.162 | 0.228 | 0.141 | 0.168 | 0.148 | 0.178 | 0.12 | 0.2 | 0.217 | 0.131 | 0.14 | 0.161 | 0.183 | 0.149 | 0.214 | 0.193 | 0.11 | 0.147 | 0.153 | 0.151 | 0.11 | 0.212 | 0.223 | 0.217 | 0.142 | 0.174 | 0.183 | 0.131 | 0.176 | 0.162 | 0.19 | 0.194 | 0.159 | 0.168 | 0.15 | 0.115 | 0.205 | 0.203 | 0.182 | 0.149 | 0.177 | 0.175 | 0.169 | 0.192 | 0.124 | 0.148 | 0.185 | 0.161 | 0.215 | 0.199 | 0.13 | 0.165 | 0.171 | 0.154 | 0.169 | 0.16 | 0.155 | 0.129 | 0.175 | 0.154 | 0.128 | 0.191 | 0.154 | 0.146 | 0.138 | 0.11 | 0.146 | 0.122 | 0.162 | 0.15 | 0.185 | 0.141 | 0.164 | 0.173 | 0.156 | 0.157 | 0.169 | 0.204 | 0.226 | 0.213 | 0.152 | 0.215 | 0.161 | 0.147 | 0.145 | 0.109 | 0.161 | 0.114 | 0.195 | 0.142 | 0.191 | 0.186 | 0.187 | 0.111 | 0.166 | 0.189 | 0.126 | 0.151 | 0.158 | 0.163 | 0.157 | 0.112 | 0.151 | 0.194 | 0.148 | 0.169 | 0.198 | 0.109 | 0.158 | 0.115 | 0.209 | 0.221 | 0.143 | 0.11 | 0.146 | 0.16 | 0.157 | 0.155 | 0.112 | 0.148 | 0.187 | 0.121 | 0.203 | 0.134 | 0.115 | 0.183 | 0.106 | 0.139 | 0.184 | 0.168 | 0.156 | 0.171 | 0.182 | 0.168 | 0.197 | 0.22 | 0.224 | 0.189 | 0.185 | 0.158 | 0.158 | 0.117 | 0.19 | 0.132 | 0.184 | 0.16 | 0.159 | 0.178 | 0.158 | 0.135 | 0.17 | 0.214 | 0.175 | 0.225 | 0.218 | 0.171 | 0.156 | 0.111 | 0.126 | 0.173 | 0.118 | 0.161 | 0.167 | 0.18 | 0.128 | 0.107 | 0.219 | 0.106 | 0.183 | 0.177 | 0.178 | 0.189 | 0.153 | 0.181 | 0.186 | 0.145 | 0.149 | 0.177 | 0.138 | 0.174 | 0.214 | 0.164 | 0.216 | 0.215 | 0.206 | 0.111 | 0.19 | 0.174 | 0.177 | 0.144 | 0.14 | 0.167 | 0.157 | 0.153 | 0.131 | 0.152 | 0.106 | 0.139 | 0.118 | 0.177 | 0.152 | 0.143 | 0.17 | 0.205 | 0.13 | 0.187 | 0.144 | 0.158 | 0.176 | 0.132 | 0.146 | 0.177 | 0.182 | 0.147 | 0.13 | 0.116 | 0.156 | 0.157 | 0.183 | 0.185 | 0.141 | 0.191 | 0.147 | 0.108 | 0.157 | 0.159 | 0.161 | 0.155 | 0.146 | 0.166 | 0.198 | 0.162 | 0.188 | 0.116 | 0.205 | 0.119 |
| Dec | 0.123 | 0.168 | 0.158 | 0.147 | 0.22 | 0.102 | 0.16 | 0.167 | 0.155 | 0.18 | 0.163 | 0.169 | 0.157 | 0.181 | 0.164 | 0.161 | 0.136 | 0.133 | 0.163 | 0.151 | 0.13 | 0.168 | 0.151 | 0.152 | 0.159 | 0.148 | 0.101 | 0.201 | 0.155 | 0.157 | 0.143 | 0.226 | 0.215 | 0.17 | 0.148 | 0.169 | 0.159 | 0.157 | 0.165 | 0.209 | 0.105 | 0.202 | 0.149 | 0.172 | 0.151 | 0.164 | 0.169 | 0.175 | 0.209 | 0.154 | 0.169 | 0.171 | 0.17 | 0.228 | 0.175 | 0.197 | 0.175 | 0.155 | 0.171 | 0.213 | 0.159 | 0.169 | 0.178 | 0.157 | 0.125 | 0.165 | 0.165 | 0.179 | 0.179 | 0.221 | 0.152 | 0.142 | 0.102 | 0.201 | 0.145 | 0.157 | 0.197 | 0.2 | 0.154 | 0.14 | 0.166 | 0.161 | 0.14 | 0.17 | 0.174 | 0.182 | 0.186 | 0.145 | 0.165 | 0.207 | 0.12 | 0.176 | 0.164 | 0.174 | 0.214 | 0.158 | 0.148 | 0.21 | 0.232 | 0.146 | 0.179 | 0.156 | 0.168 | 0.21 | 0.102 | 0.098 | 0.167 | 0.156 | 0.2 | 0.192 | 0.146 | 0.163 | 0.181 | 0.172 | 0.139 | 0.139 | 0.223 | 0.103 | 0.217 | 0.174 | 0.158 | 0.146 | 0.18 | 0.16 | 0.166 | 0.157 | 0.197 | 0.15 | 0.145 | 0.148 | 0.172 | 0.191 | 0.164 | 0.159 | 0.105 | 0.14 | 0.164 | 0.124 | 0.138 | 0.152 | 0.158 | 0.162 | 0.114 | 0.184 | 0.15 | 0.213 | 0.126 | 0.173 | 0.166 | 0.169 | 0.153 | 0.178 | 0.165 | 0.149 | 0.171 | 0.165 | 0.196 | 0.213 | 0.119 | 0.117 | 0.173 | 0.208 | 0.153 | 0.228 | 0.183 | 0.168 | 0.194 | 0.162 | 0.165 | 0.163 | 0.217 | 0.145 | 0.13 | 0.191 | 0.136 | 0.199 | 0.11 | 0.161 | 0.145 | 0.142 | 0.171 | 0.152 | 0.161 | 0.171 | 0.111 | 0.185 | 0.129 | 0.115 | 0.17 | 0.144 | 0.135 | 0.168 | 0.105 | 0.177 | 0.163 | 0.179 | 0.158 | 0.168 | 0.173 | 0.142 | 0.16 | 0.182 | 0.108 | 0.181 | 0.203 | 0.17 | 0.144 | 0.163 | 0.149 | 0.145 | 0.15 | 0.139 | 0.131 | 0.122 | 0.167 | 0.217 | 0.164 | 0.173 | 0.149 | 0.187 | 0.229 | 0.171 | 0.116 | 0.21 | 0.203 | 0.167 | 0.111 | 0.22 | 0.136 | 0.18 | 0.185 | 0.184 | 0.15 | 0.11 | 0.135 | 0.107 | 0.215 | 0.143 | 0.182 | 0.178 | 0.171 | 0.174 | 0.215 | 0.188 | 0.166 | 0.153 | 0.112 | 0.157 | 0.157 | 0.152 |